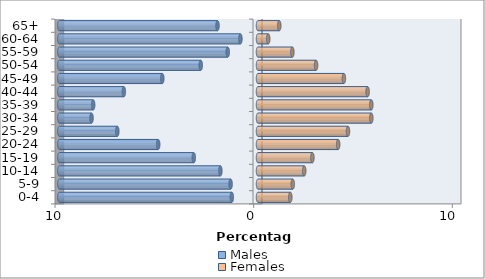
| Category | Males | Females |
|---|---|---|
| 0-4 | -1.318 | 1.627 |
| 5-9 | -1.379 | 1.75 |
| 10-14 | -1.894 | 2.327 |
| 15-19 | -3.232 | 2.738 |
| 20-24 | -5.024 | 4.035 |
| 25-29 | -7.083 | 4.53 |
| 30-34 | -8.38 | 5.703 |
| 35-39 | -8.297 | 5.703 |
| 40-44 | -6.753 | 5.518 |
| 45-49 | -4.818 | 4.324 |
| 50-54 | -2.882 | 2.924 |
| 55-59 | -1.524 | 1.729 |
| 60-64 | -0.885 | 0.515 |
| 65+ | -2.038 | 1.071 |